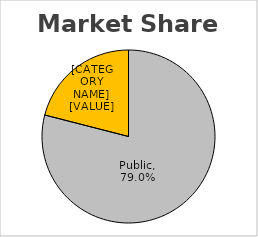
| Category | Series 0 |
|---|---|
| Public | 0.79 |
| Non Public | 0.21 |